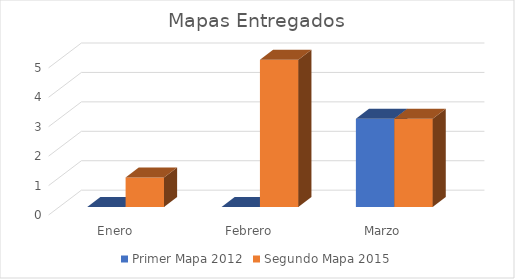
| Category | Primer Mapa 2012 | Segundo Mapa 2015 |
|---|---|---|
| Enero | 0 | 1 |
| Febrero | 0 | 5 |
| Marzo | 3 | 3 |